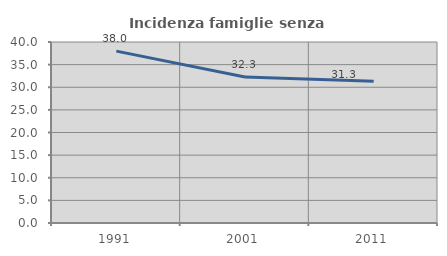
| Category | Incidenza famiglie senza nuclei |
|---|---|
| 1991.0 | 37.989 |
| 2001.0 | 32.258 |
| 2011.0 | 31.349 |